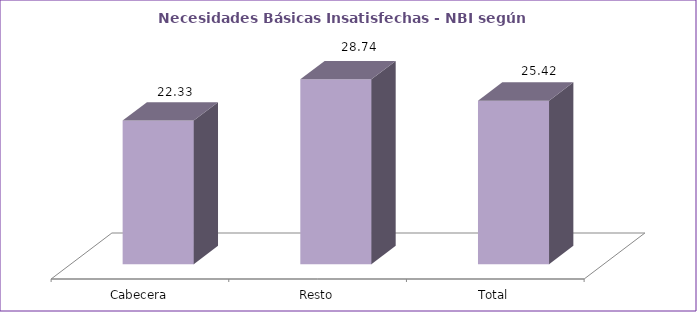
| Category | Series 0 |
|---|---|
| Cabecera | 22.33 |
| Resto | 28.74 |
| Total | 25.42 |